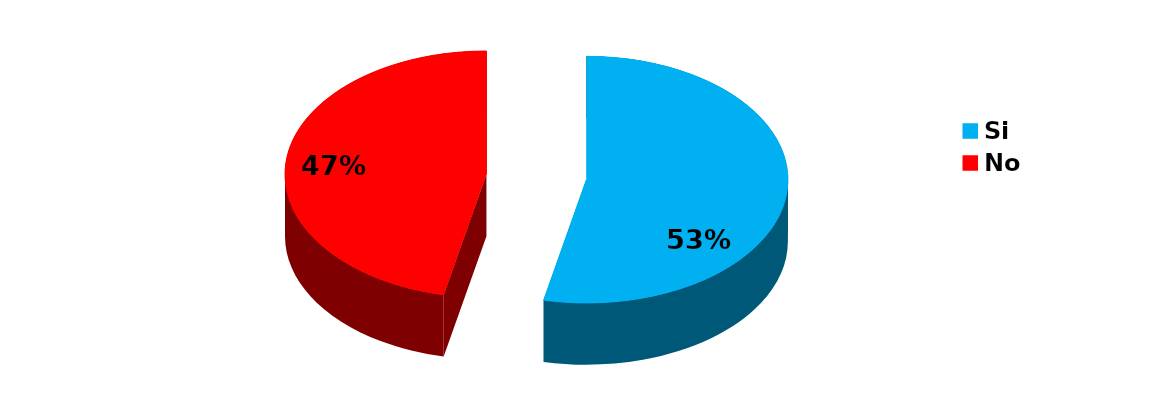
| Category | Series 0 |
|---|---|
| Si | 102 |
| No | 89 |